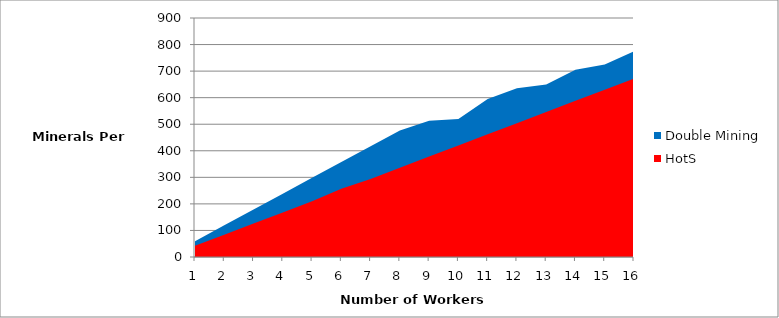
| Category | Double Mining | HotS |
|---|---|---|
| 0 | 59.6 | 42 |
| 1 | 119.2 | 84 |
| 2 | 178.8 | 126 |
| 3 | 238.4 | 168 |
| 4 | 298 | 210 |
| 5 | 357.6 | 257 |
| 6 | 417.2 | 294 |
| 7 | 476.8 | 336 |
| 8 | 513 | 378 |
| 9 | 520 | 420 |
| 10 | 595 | 462 |
| 11 | 635 | 504 |
| 12 | 650 | 546 |
| 13 | 705 | 588 |
| 14 | 725 | 630 |
| 15 | 775 | 672 |